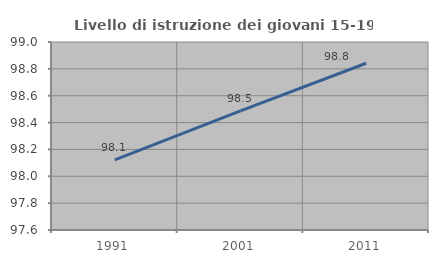
| Category | Livello di istruzione dei giovani 15-19 anni |
|---|---|
| 1991.0 | 98.122 |
| 2001.0 | 98.487 |
| 2011.0 | 98.842 |